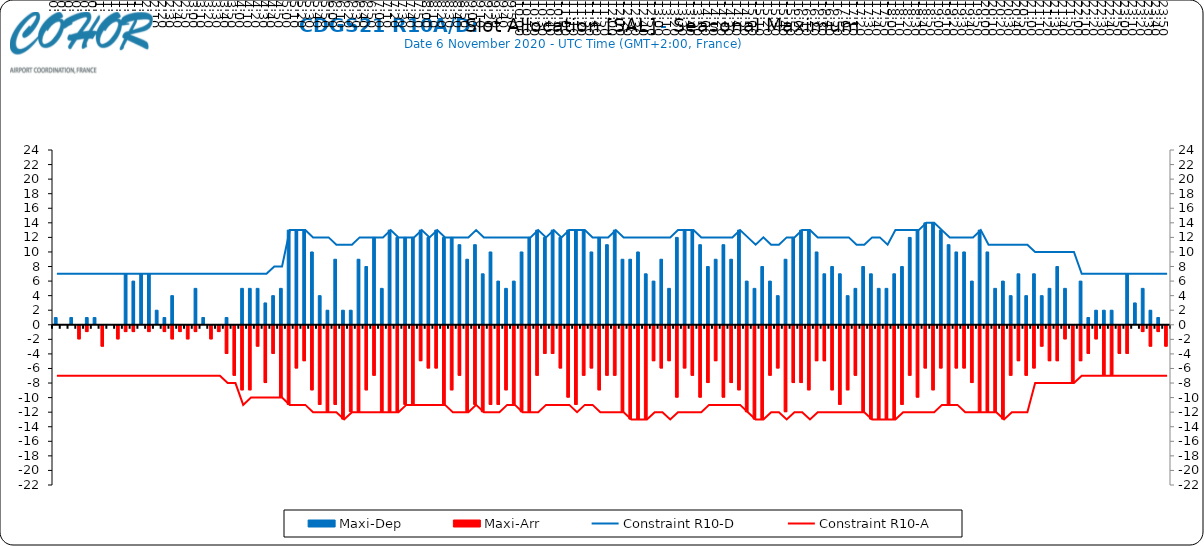
| Category | Maxi-Dep | Maxi-Arr |
|---|---|---|
| 0.0 | 1 | 0 |
| 0.006944444444444444 | 0 | 0 |
| 0.013888888888888888 | 1 | 0 |
| 0.020833333333333332 | 0 | -2 |
| 0.027777777777777776 | 1 | -1 |
| 0.034722222222222224 | 1 | 0 |
| 0.041666666666666664 | 0 | -3 |
| 0.04861111111111111 | 0 | 0 |
| 0.05555555555555555 | 0 | -2 |
| 0.0625 | 7 | -1 |
| 0.06944444444444443 | 6 | -1 |
| 0.0763888888888889 | 7 | 0 |
| 0.08333333333333333 | 7 | -1 |
| 0.09027777777777778 | 2 | 0 |
| 0.09722222222222222 | 1 | -1 |
| 0.10416666666666667 | 4 | -2 |
| 0.1111111111111111 | 0 | -1 |
| 0.11805555555555557 | 0 | -2 |
| 0.125 | 5 | -1 |
| 0.13194444444444445 | 1 | 0 |
| 0.1388888888888889 | 0 | -2 |
| 0.14583333333333334 | 0 | -1 |
| 0.15277777777777776 | 1 | -4 |
| 0.15972222222222224 | 0 | -7 |
| 0.16666666666666666 | 5 | -9 |
| 0.17361111111111113 | 5 | -9 |
| 0.18055555555555555 | 5 | -3 |
| 0.1875 | 3 | -8 |
| 0.19444444444444445 | 4 | -4 |
| 0.20138888888888887 | 5 | -10 |
| 0.20833333333333334 | 13 | -11 |
| 0.2152777777777778 | 13 | -6 |
| 0.2222222222222222 | 13 | -5 |
| 0.22916666666666666 | 10 | -9 |
| 0.23611111111111113 | 4 | -11 |
| 0.24305555555555555 | 2 | -12 |
| 0.25 | 9 | -11 |
| 0.2569444444444445 | 2 | -13 |
| 0.2638888888888889 | 2 | -12 |
| 0.2708333333333333 | 9 | -12 |
| 0.2777777777777778 | 8 | -9 |
| 0.2847222222222222 | 12 | -7 |
| 0.2916666666666667 | 5 | -12 |
| 0.2986111111111111 | 13 | -12 |
| 0.3055555555555555 | 12 | -12 |
| 0.3125 | 12 | -11 |
| 0.3194444444444445 | 12 | -11 |
| 0.3263888888888889 | 13 | -5 |
| 0.3333333333333333 | 12 | -6 |
| 0.34027777777777773 | 13 | -6 |
| 0.34722222222222227 | 12 | -11 |
| 0.3541666666666667 | 12 | -9 |
| 0.3611111111111111 | 11 | -7 |
| 0.3680555555555556 | 9 | -12 |
| 0.375 | 11 | -11 |
| 0.3819444444444444 | 7 | -12 |
| 0.3888888888888889 | 10 | -11 |
| 0.3958333333333333 | 6 | -11 |
| 0.40277777777777773 | 5 | -9 |
| 0.40972222222222227 | 6 | -11 |
| 0.4166666666666667 | 10 | -12 |
| 0.4236111111111111 | 12 | -12 |
| 0.4305555555555556 | 13 | -7 |
| 0.4375 | 12 | -4 |
| 0.4444444444444444 | 13 | -4 |
| 0.4513888888888889 | 12 | -6 |
| 0.4583333333333333 | 13 | -10 |
| 0.46527777777777773 | 13 | -11 |
| 0.47222222222222227 | 13 | -7 |
| 0.4791666666666667 | 10 | -6 |
| 0.4861111111111111 | 12 | -9 |
| 0.4930555555555556 | 11 | -7 |
| 0.5 | 13 | -7 |
| 0.5069444444444444 | 9 | -12 |
| 0.513888888888889 | 9 | -13 |
| 0.5208333333333334 | 10 | -13 |
| 0.5277777777777778 | 7 | -13 |
| 0.5347222222222222 | 6 | -5 |
| 0.5416666666666666 | 9 | -6 |
| 0.548611111111111 | 5 | -5 |
| 0.5555555555555556 | 12 | -10 |
| 0.5625 | 13 | -6 |
| 0.5694444444444444 | 13 | -7 |
| 0.576388888888889 | 11 | -10 |
| 0.5833333333333334 | 8 | -8 |
| 0.5902777777777778 | 9 | -5 |
| 0.5972222222222222 | 11 | -10 |
| 0.6041666666666666 | 9 | -8 |
| 0.611111111111111 | 13 | -9 |
| 0.6180555555555556 | 6 | -12 |
| 0.625 | 5 | -13 |
| 0.6319444444444444 | 8 | -13 |
| 0.638888888888889 | 6 | -7 |
| 0.6458333333333334 | 4 | -6 |
| 0.6527777777777778 | 9 | -12 |
| 0.6597222222222222 | 12 | -8 |
| 0.6666666666666666 | 13 | -8 |
| 0.6736111111111112 | 13 | -9 |
| 0.6805555555555555 | 10 | -5 |
| 0.6875 | 7 | -5 |
| 0.6944444444444445 | 8 | -9 |
| 0.7013888888888888 | 7 | -11 |
| 0.7083333333333334 | 4 | -9 |
| 0.7152777777777778 | 5 | -7 |
| 0.7222222222222222 | 8 | -12 |
| 0.7291666666666666 | 7 | -13 |
| 0.7361111111111112 | 5 | -13 |
| 0.7430555555555555 | 5 | -13 |
| 0.75 | 7 | -13 |
| 0.7569444444444445 | 8 | -11 |
| 0.7638888888888888 | 12 | -7 |
| 0.7708333333333334 | 13 | -10 |
| 0.7777777777777778 | 14 | -6 |
| 0.7847222222222222 | 14 | -9 |
| 0.7916666666666666 | 13 | -6 |
| 0.7986111111111112 | 11 | -11 |
| 0.8055555555555555 | 10 | -6 |
| 0.8125 | 10 | -6 |
| 0.8194444444444445 | 6 | -8 |
| 0.8263888888888888 | 13 | -12 |
| 0.8333333333333334 | 10 | -12 |
| 0.8402777777777778 | 5 | -12 |
| 0.8472222222222222 | 6 | -13 |
| 0.8541666666666666 | 4 | -7 |
| 0.8611111111111112 | 7 | -5 |
| 0.8680555555555555 | 4 | -7 |
| 0.875 | 7 | -6 |
| 0.8819444444444445 | 4 | -3 |
| 0.8888888888888888 | 5 | -5 |
| 0.8958333333333334 | 8 | -5 |
| 0.9027777777777778 | 5 | -2 |
| 0.9097222222222222 | 0 | -8 |
| 0.9166666666666666 | 6 | -5 |
| 0.9236111111111112 | 1 | -4 |
| 0.9305555555555555 | 2 | -2 |
| 0.9375 | 2 | -7 |
| 0.9444444444444445 | 2 | -7 |
| 0.9513888888888888 | 0 | -4 |
| 0.9583333333333334 | 7 | -4 |
| 0.9652777777777778 | 3 | 0 |
| 0.9722222222222222 | 5 | -1 |
| 0.9791666666666666 | 2 | -3 |
| 0.9861111111111112 | 1 | -1 |
| 0.9930555555555555 | 0 | -3 |